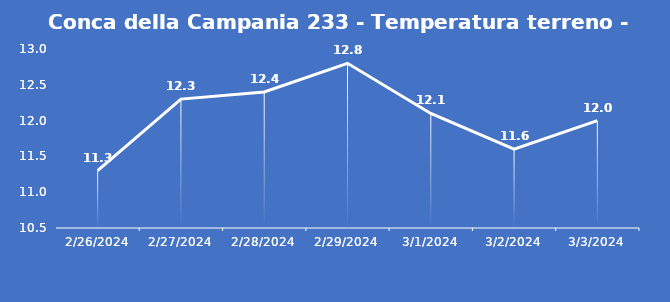
| Category | Conca della Campania 233 - Temperatura terreno - Grezzo (°C) |
|---|---|
| 2/26/24 | 11.3 |
| 2/27/24 | 12.3 |
| 2/28/24 | 12.4 |
| 2/29/24 | 12.8 |
| 3/1/24 | 12.1 |
| 3/2/24 | 11.6 |
| 3/3/24 | 12 |